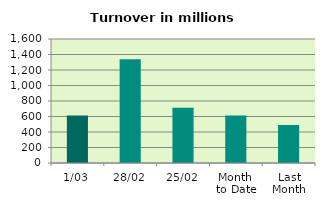
| Category | Series 0 |
|---|---|
| 1/03 | 613.294 |
| 28/02 | 1338.266 |
| 25/02 | 711.383 |
| Month 
to Date | 613.294 |
| Last
Month | 490.433 |